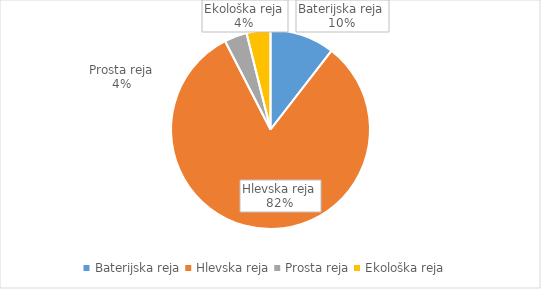
| Category | Količina kosov jajc |
|---|---|
| Baterijska reja | 250526 |
| Hlevska reja | 1959648 |
| Prosta reja | 87977 |
| Ekološka reja | 92787 |